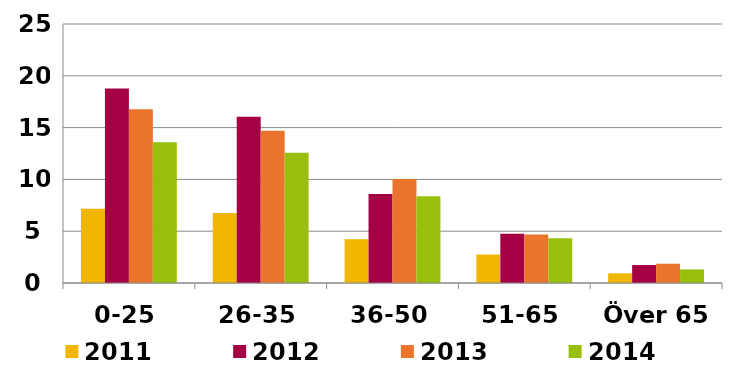
| Category | 2011 | 2012 | 2013 | 2014 |
|---|---|---|---|---|
| 0-25 | 7.159 | 18.783 | 16.763 | 13.59 |
| 26-35 | 6.767 | 16.057 | 14.692 | 12.568 |
| 36-50 | 4.215 | 8.602 | 10.048 | 8.364 |
| 51-65 | 2.748 | 4.754 | 4.679 | 4.326 |
| Över 65 | 0.938 | 1.733 | 1.86 | 1.31 |